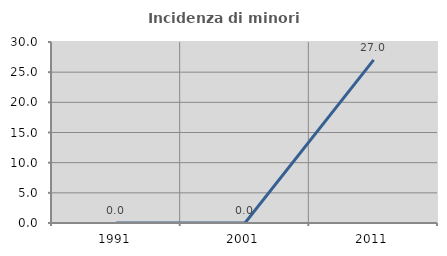
| Category | Incidenza di minori stranieri |
|---|---|
| 1991.0 | 0 |
| 2001.0 | 0 |
| 2011.0 | 27.027 |